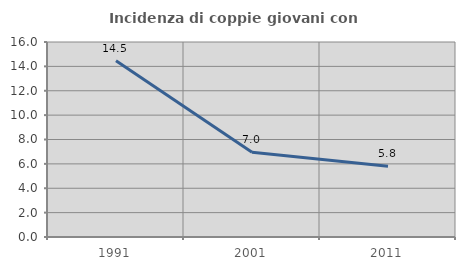
| Category | Incidenza di coppie giovani con figli |
|---|---|
| 1991.0 | 14.465 |
| 2001.0 | 6.962 |
| 2011.0 | 5.797 |